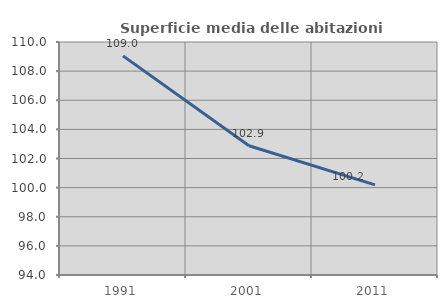
| Category | Superficie media delle abitazioni occupate |
|---|---|
| 1991.0 | 109.047 |
| 2001.0 | 102.876 |
| 2011.0 | 100.19 |